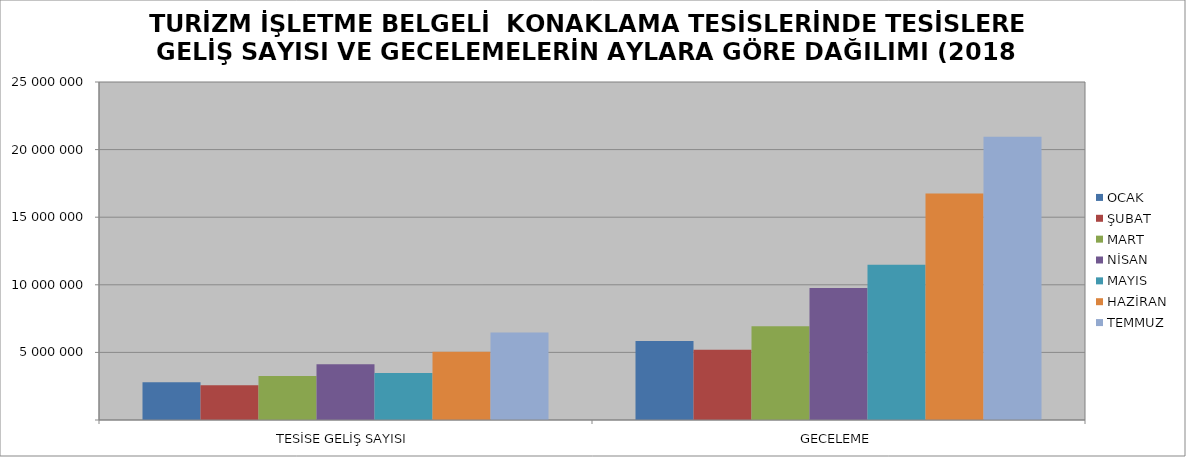
| Category | OCAK | ŞUBAT | MART | NİSAN | MAYIS | HAZİRAN | TEMMUZ |
|---|---|---|---|---|---|---|---|
| TESİSE GELİŞ SAYISI | 2792196 | 2573999 | 3258929 | 4119434 | 3468117 | 5043280 | 6471045 |
| GECELEME | 5837753 | 5199578 | 6939659 | 9767435 | 11484758 | 16745602 | 20944829 |